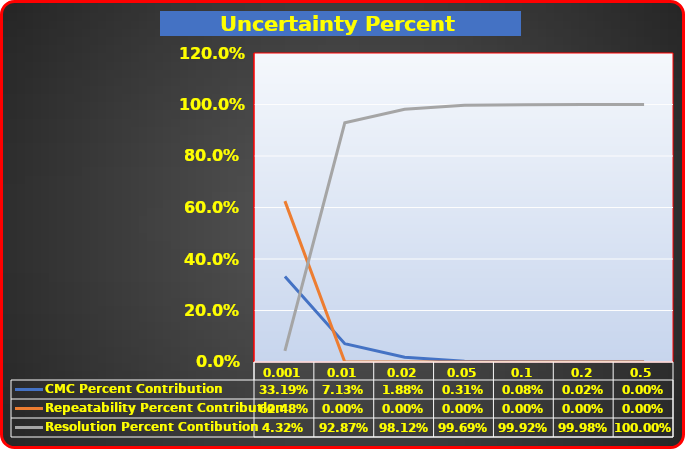
| Category | CMC Percent Contribution | Repeatability Percent Contribution | Resolution Percent Contibution |
|---|---|---|---|
| 0.001 | 0.332 | 0.625 | 0.043 |
| 0.01 | 0.071 | 0 | 0.929 |
| 0.02 | 0.019 | 0 | 0.981 |
| 0.05 | 0.003 | 0 | 0.997 |
| 0.1 | 0.001 | 0 | 0.999 |
| 0.2 | 0 | 0 | 1 |
| 0.5 | 0 | 0 | 1 |